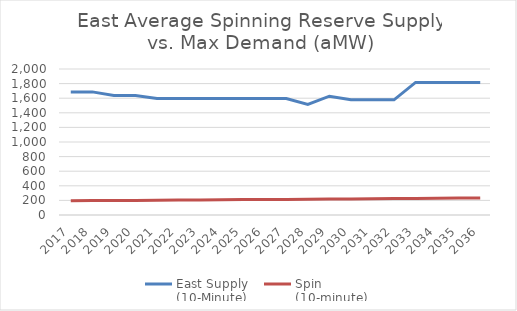
| Category | East Supply
(10-Minute) | Spin
(10-minute) |
|---|---|---|
| 2017.0 | 1686.425 | 195.325 |
| 2018.0 | 1686.402 | 197.17 |
| 2019.0 | 1636.423 | 197.943 |
| 2020.0 | 1636.505 | 200.211 |
| 2021.0 | 1596.423 | 202.868 |
| 2022.0 | 1596.423 | 205.22 |
| 2023.0 | 1596.423 | 206.948 |
| 2024.0 | 1596.505 | 209.042 |
| 2025.0 | 1596.423 | 211.613 |
| 2026.0 | 1596.423 | 211.414 |
| 2027.0 | 1596.415 | 213.382 |
| 2028.0 | 1515.821 | 214.967 |
| 2029.0 | 1627.715 | 217.524 |
| 2030.0 | 1577.715 | 219.495 |
| 2031.0 | 1577.715 | 221.903 |
| 2032.0 | 1577.821 | 225.369 |
| 2033.0 | 1815.715 | 227.31 |
| 2034.0 | 1815.715 | 228.483 |
| 2035.0 | 1815.715 | 231.314 |
| 2036.0 | 1815.821 | 234.57 |